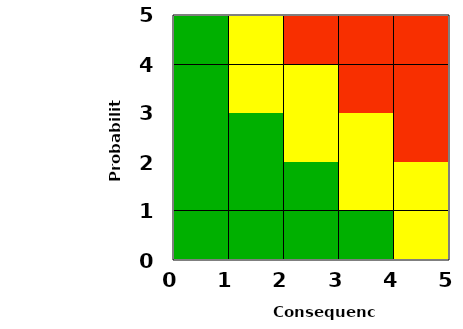
| Category | Series 0 |
|---|---|
| 2.75 | 0 |